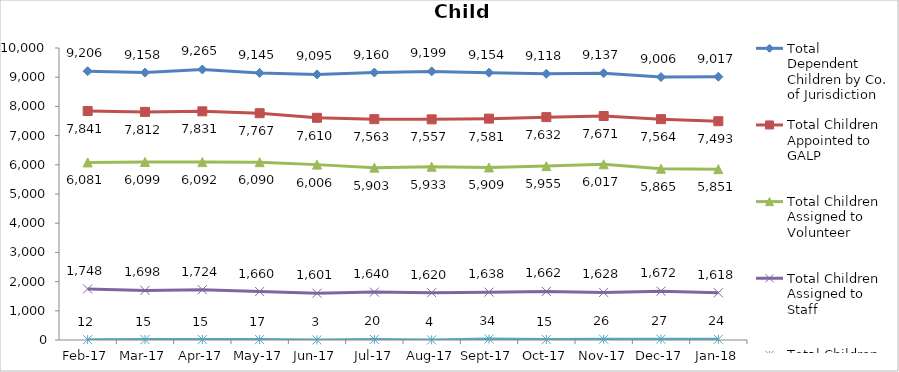
| Category | Total Dependent Children by Co. of Jurisdiction | Total Children Appointed to GALP | Total Children Assigned to Volunteer | Total Children Assigned to Staff | Total Children Unassigned |
|---|---|---|---|---|---|
| 2017-02-01 | 9206 | 7841 | 6081 | 1748 | 12 |
| 2017-03-01 | 9158 | 7812 | 6099 | 1698 | 15 |
| 2017-04-01 | 9265 | 7831 | 6092 | 1724 | 15 |
| 2017-05-01 | 9145 | 7767 | 6090 | 1660 | 17 |
| 2017-06-01 | 9095 | 7610 | 6006 | 1601 | 3 |
| 2017-07-01 | 9160 | 7563 | 5903 | 1640 | 20 |
| 2017-08-01 | 9199 | 7557 | 5933 | 1620 | 4 |
| 2017-09-01 | 9154 | 7581 | 5909 | 1638 | 34 |
| 2017-10-01 | 9118 | 7632 | 5955 | 1662 | 15 |
| 2017-11-01 | 9137 | 7671 | 6017 | 1628 | 26 |
| 2017-12-01 | 9006 | 7564 | 5865 | 1672 | 27 |
| 2018-01-01 | 9017 | 7493 | 5851 | 1618 | 24 |